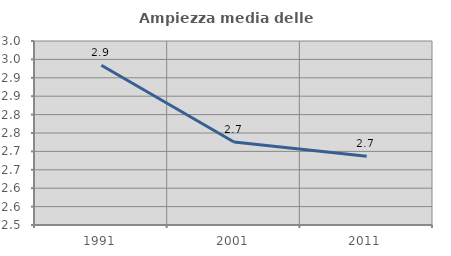
| Category | Ampiezza media delle famiglie |
|---|---|
| 1991.0 | 2.934 |
| 2001.0 | 2.726 |
| 2011.0 | 2.687 |